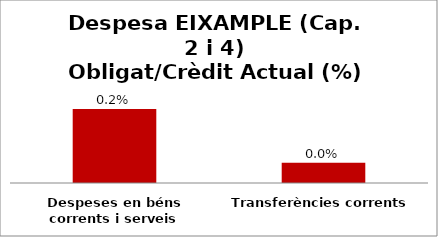
| Category | Series 0 |
|---|---|
| Despeses en béns corrents i serveis | 0.002 |
| Transferències corrents | 0 |